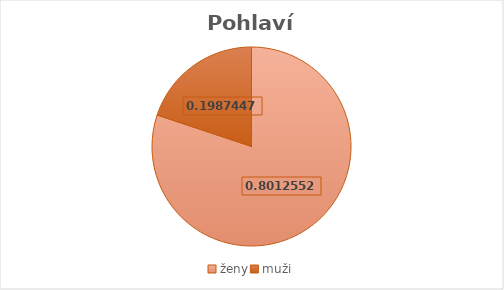
| Category | Series 0 |
|---|---|
| ženy | 383 |
| muži | 95 |